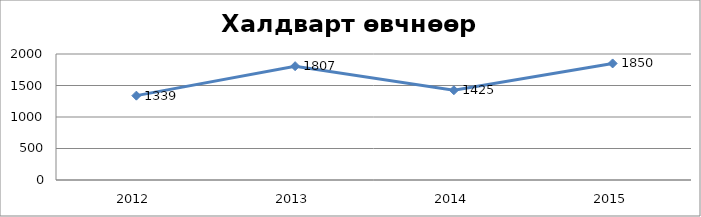
| Category | Халдварт өвчнөөр өвчлөгчид |
|---|---|
| 2012.0 | 1339 |
| 2013.0 | 1807 |
| 2014.0 | 1425 |
| 2015.0 | 1850 |